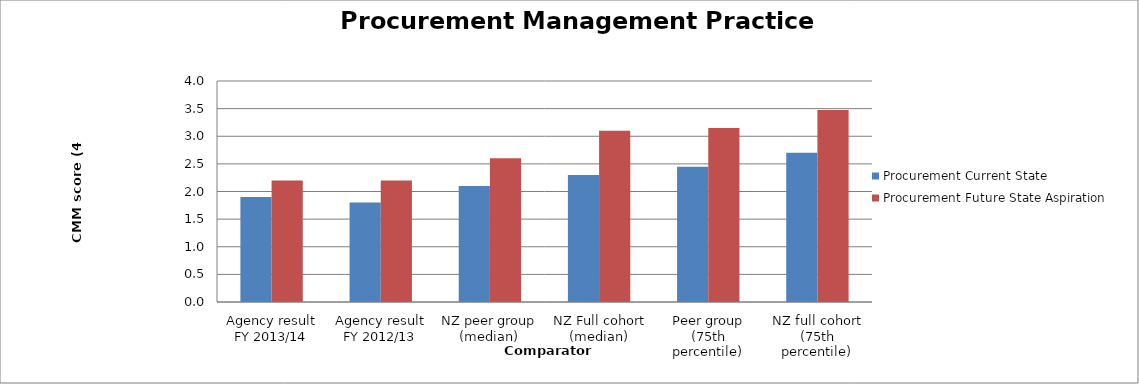
| Category | Procurement Current State | Procurement Future State Aspiration |
|---|---|---|
| Agency result FY 2013/14 | 1.9 | 2.2 |
| Agency result FY 2012/13 | 1.8 | 2.2 |
| NZ peer group (median) | 2.1 | 2.6 |
| NZ Full cohort (median) | 2.3 | 3.1 |
| Peer group (75th percentile) | 2.45 | 3.15 |
| NZ full cohort (75th percentile) | 2.7 | 3.475 |